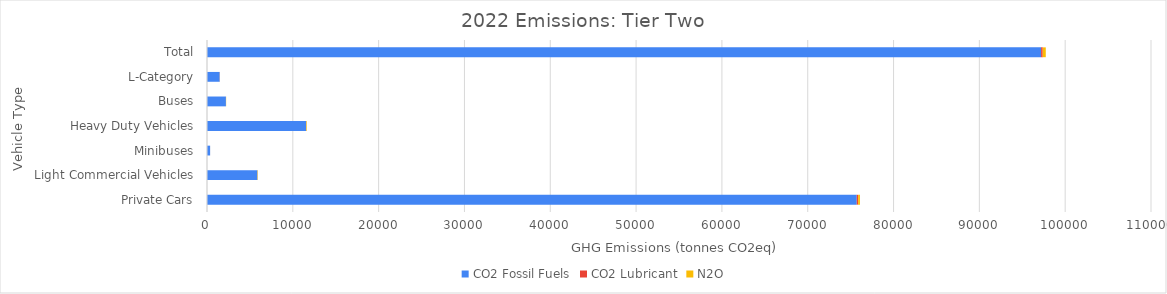
| Category | CO2 Fossil Fuels | CO2 Lubricant | N2O |
|---|---|---|---|
| Private Cars | 75713.434 | 158.71 | 213.349 |
| Light Commercial Vehicles | 5876.285 | 9.893 | 42.237 |
| Minibuses | 363.181 | 0.578 | 2.134 |
| Heavy Duty Vehicles | 11553.375 | 10.381 | 65.166 |
| Buses | 2206.59 | 0.644 | 23.461 |
| L-Category | 1479.264 | 12.211 | 7.376 |
| Total | 97192.128 | 192.416 | 353.723 |